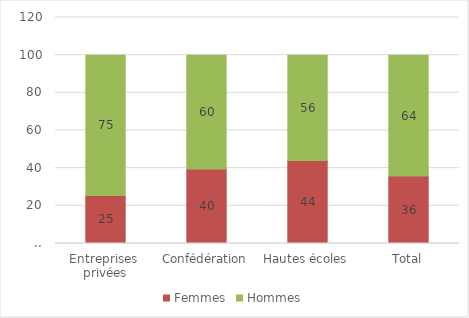
| Category | Femmes | Hommes |
|---|---|---|
| Entreprises 
privées | 25.487 | 74.513 |
| Confédération | 39.616 | 60.384 |
| Hautes écoles | 44.093 | 55.907 |
| Total | 35.809 | 64.191 |